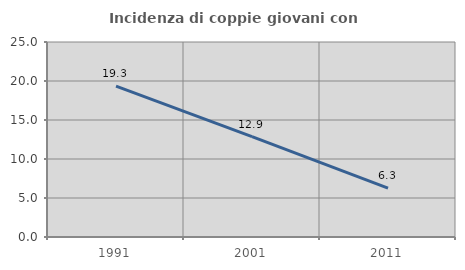
| Category | Incidenza di coppie giovani con figli |
|---|---|
| 1991.0 | 19.349 |
| 2001.0 | 12.867 |
| 2011.0 | 6.27 |